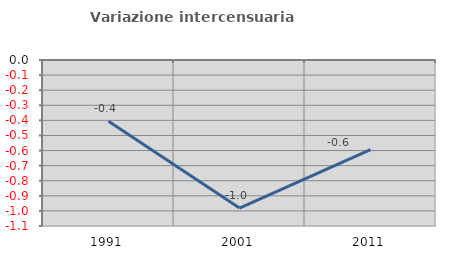
| Category | Variazione intercensuaria annua |
|---|---|
| 1991.0 | -0.406 |
| 2001.0 | -0.981 |
| 2011.0 | -0.594 |